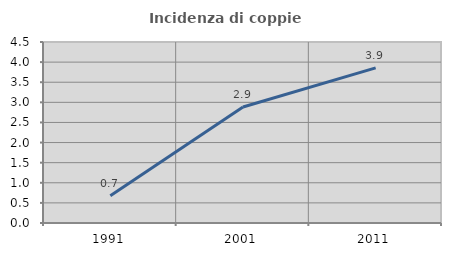
| Category | Incidenza di coppie miste |
|---|---|
| 1991.0 | 0.676 |
| 2001.0 | 2.885 |
| 2011.0 | 3.857 |